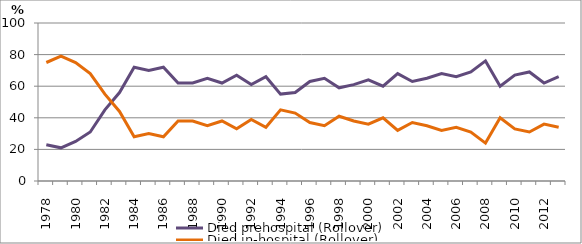
| Category | Died prehospital (Rollover) | Died in-hospital (Rollover) |
|---|---|---|
| 1978.0 | 23 | 75 |
| 1979.0 | 21 | 79 |
| 1980.0 | 25 | 75 |
| 1981.0 | 31 | 68 |
| 1982.0 | 45 | 55 |
| 1983.0 | 56 | 44 |
| 1984.0 | 72 | 28 |
| 1985.0 | 70 | 30 |
| 1986.0 | 72 | 28 |
| 1987.0 | 62 | 38 |
| 1988.0 | 62 | 38 |
| 1989.0 | 65 | 35 |
| 1990.0 | 62 | 38 |
| 1991.0 | 67 | 33 |
| 1992.0 | 61 | 39 |
| 1993.0 | 66 | 34 |
| 1994.0 | 55 | 45 |
| 1995.0 | 56 | 43 |
| 1996.0 | 63 | 37 |
| 1997.0 | 65 | 35 |
| 1998.0 | 59 | 41 |
| 1999.0 | 61 | 38 |
| 2000.0 | 64 | 36 |
| 2001.0 | 60 | 40 |
| 2002.0 | 68 | 32 |
| 2003.0 | 63 | 37 |
| 2004.0 | 65 | 35 |
| 2005.0 | 68 | 32 |
| 2006.0 | 66 | 34 |
| 2007.0 | 69 | 31 |
| 2008.0 | 76 | 24 |
| 2009.0 | 60 | 40 |
| 2010.0 | 67 | 33 |
| 2011.0 | 69 | 31 |
| 2012.0 | 62 | 36 |
| 2013.0 | 66 | 34 |